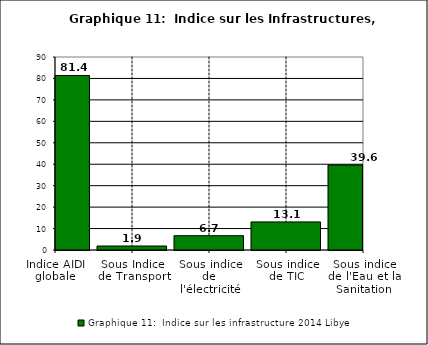
| Category | Graphique 11:  Indice sur les infrastructure 2014 |
|---|---|
| Indice AIDI globale | 81.381 |
| Sous Indice de Transport | 1.859 |
| Sous indice de l'électricité | 6.667 |
| Sous indice de TIC | 13.092 |
| Sous indice de l'Eau et la Sanitation | 39.617 |